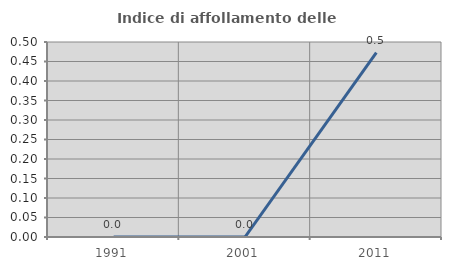
| Category | Indice di affollamento delle abitazioni  |
|---|---|
| 1991.0 | 0 |
| 2001.0 | 0 |
| 2011.0 | 0.473 |